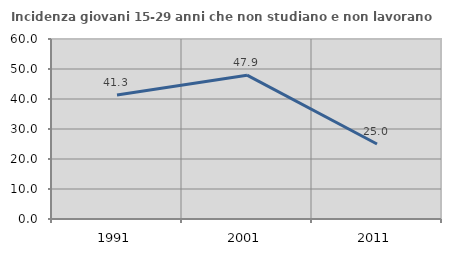
| Category | Incidenza giovani 15-29 anni che non studiano e non lavorano  |
|---|---|
| 1991.0 | 41.338 |
| 2001.0 | 47.945 |
| 2011.0 | 25 |